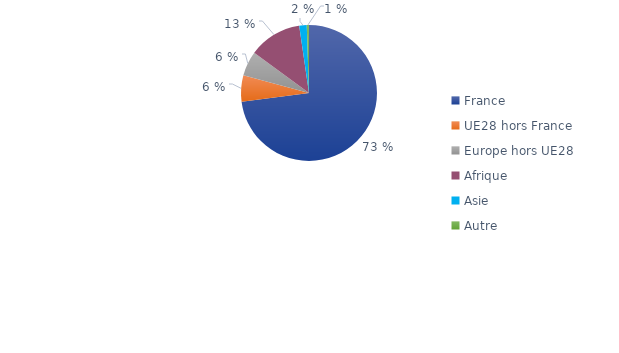
| Category | Series 0 |
|---|---|
| France | 0.729 |
| UE28 hors France | 0.063 |
| Europe hors UE28 | 0.059 |
| Afrique | 0.126 |
| Asie | 0.018 |
| Autre | 0.005 |